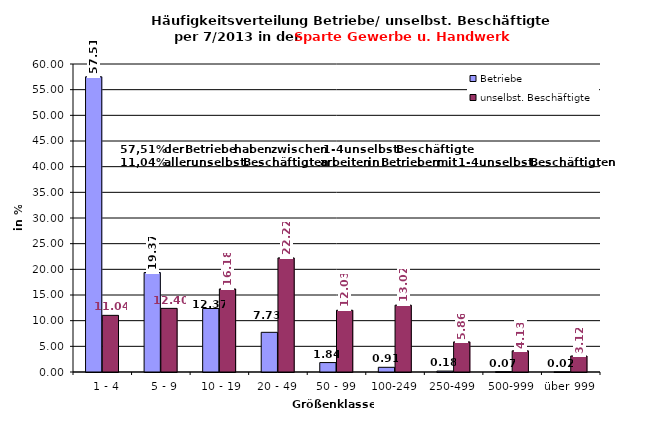
| Category | Betriebe | unselbst. Beschäftigte |
|---|---|---|
|   1 - 4 | 57.51 | 11.037 |
|   5 - 9 | 19.371 | 12.397 |
|  10 - 19 | 12.368 | 16.178 |
| 20 - 49 | 7.729 | 22.223 |
| 50 - 99 | 1.836 | 12.032 |
| 100-249 | 0.914 | 13.022 |
| 250-499 | 0.181 | 5.865 |
| 500-999 | 0.068 | 4.127 |
| über 999 | 0.023 | 3.118 |